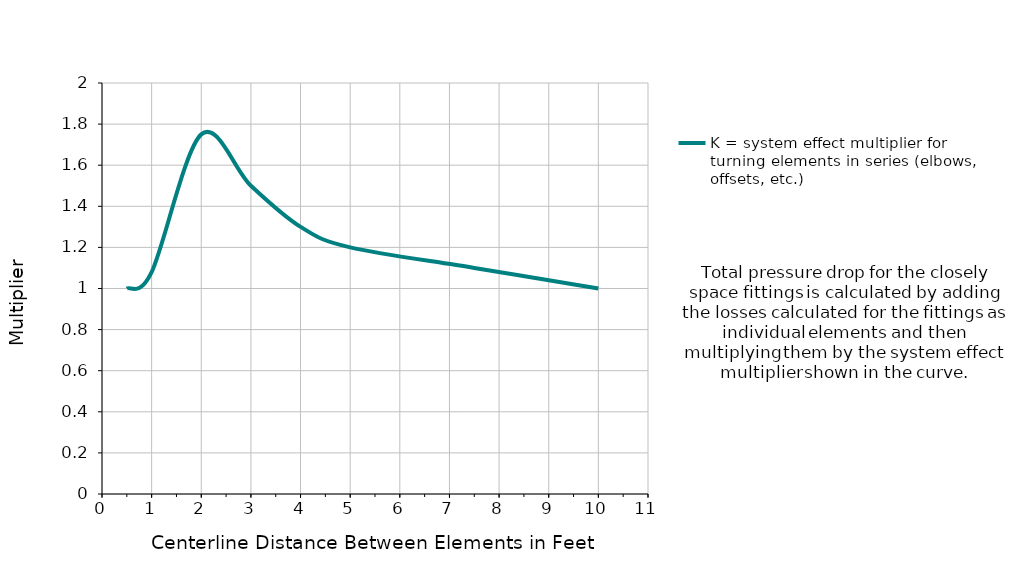
| Category | K = system effect multiplier for turning elements in series (elbows, offsets, etc.) |
|---|---|
| 0.5 | 1 |
| 1.0 | 1.08 |
| 2.0 | 1.75 |
| 3.0 | 1.5 |
| 4.0 | 1.3 |
| 5.0 | 1.2 |
| 7.5 | 1.1 |
| 10.0 | 1 |